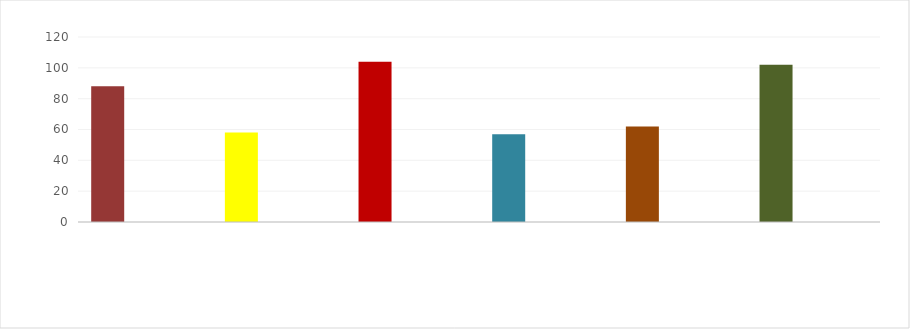
| Category | Series 0 | Series 1 | 4169-4257 enero |
|---|---|---|---|
|  | 88 |  | 0 |